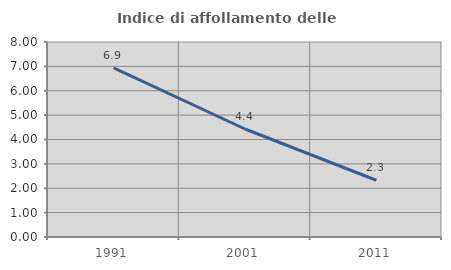
| Category | Indice di affollamento delle abitazioni  |
|---|---|
| 1991.0 | 6.94 |
| 2001.0 | 4.43 |
| 2011.0 | 2.328 |